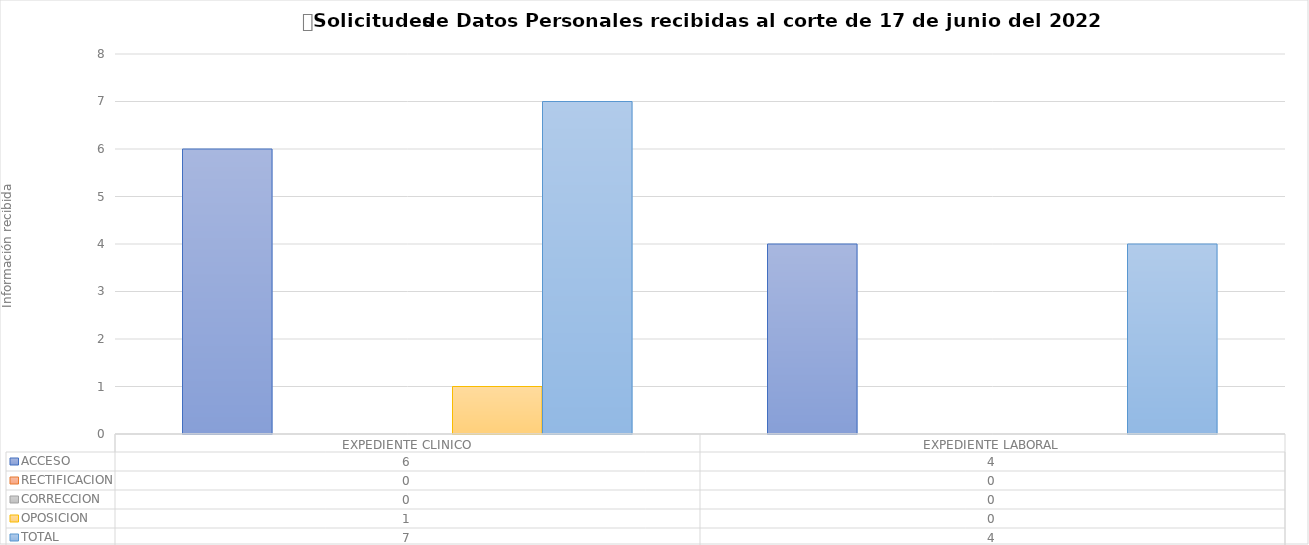
| Category | ACCESO | RECTIFICACION | CORRECCION | OPOSICION | TOTAL |
|---|---|---|---|---|---|
| EXPEDIENTE CLINICO | 6 | 0 | 0 | 1 | 7 |
| EXPEDIENTE LABORAL | 4 | 0 | 0 | 0 | 4 |